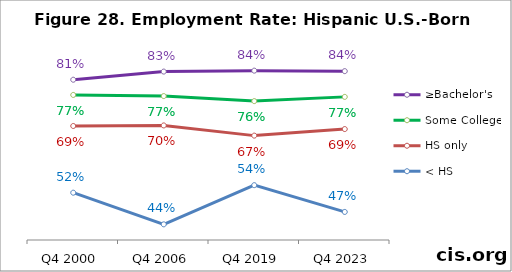
| Category | ≥Bachelor's | Some College | HS only | < HS |
|---|---|---|---|---|
| Q4 2000 | 0.813 | 0.774 | 0.694 | 0.522 |
| Q4 2006 | 0.834 | 0.771 | 0.695 | 0.44 |
| Q4 2019 | 0.836 | 0.758 | 0.669 | 0.541 |
| Q4 2023 | 0.835 | 0.769 | 0.686 | 0.472 |